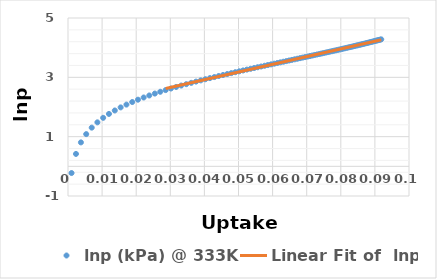
| Category | lnp (kPa) @ 333K |
|---|---|
| 0.00104 | -0.226 |
| 0.00234 | 0.418 |
| 0.00379 | 0.807 |
| 0.00534 | 1.086 |
| 0.00696 | 1.304 |
| 0.00862 | 1.483 |
| 0.01031 | 1.635 |
| 0.01201 | 1.766 |
| 0.01372 | 1.883 |
| 0.01544 | 1.987 |
| 0.01714 | 2.081 |
| 0.01884 | 2.167 |
| 0.02052 | 2.247 |
| 0.02219 | 2.32 |
| 0.02384 | 2.389 |
| 0.02546 | 2.453 |
| 0.02706 | 2.513 |
| 0.02864 | 2.57 |
| 0.03019 | 2.624 |
| 0.03171 | 2.675 |
| 0.03321 | 2.723 |
| 0.03468 | 2.769 |
| 0.03613 | 2.814 |
| 0.03754 | 2.856 |
| 0.03893 | 2.897 |
| 0.04029 | 2.936 |
| 0.04162 | 2.973 |
| 0.04293 | 3.01 |
| 0.04421 | 3.045 |
| 0.04546 | 3.078 |
| 0.04669 | 3.111 |
| 0.04789 | 3.143 |
| 0.04907 | 3.173 |
| 0.05022 | 3.203 |
| 0.05135 | 3.232 |
| 0.05245 | 3.26 |
| 0.05353 | 3.287 |
| 0.05459 | 3.314 |
| 0.05562 | 3.34 |
| 0.05664 | 3.365 |
| 0.05763 | 3.39 |
| 0.0586 | 3.414 |
| 0.05955 | 3.437 |
| 0.06048 | 3.46 |
| 0.06139 | 3.483 |
| 0.06228 | 3.505 |
| 0.06316 | 3.526 |
| 0.06401 | 3.547 |
| 0.06485 | 3.568 |
| 0.06567 | 3.588 |
| 0.06648 | 3.608 |
| 0.06726 | 3.627 |
| 0.06804 | 3.646 |
| 0.06879 | 3.665 |
| 0.06953 | 3.683 |
| 0.07026 | 3.701 |
| 0.07097 | 3.719 |
| 0.07167 | 3.736 |
| 0.07235 | 3.753 |
| 0.07302 | 3.77 |
| 0.07368 | 3.786 |
| 0.07433 | 3.802 |
| 0.07496 | 3.818 |
| 0.07558 | 3.834 |
| 0.07619 | 3.85 |
| 0.07678 | 3.865 |
| 0.07737 | 3.88 |
| 0.07794 | 3.895 |
| 0.07851 | 3.909 |
| 0.07906 | 3.924 |
| 0.07961 | 3.938 |
| 0.08014 | 3.952 |
| 0.08066 | 3.966 |
| 0.08118 | 3.979 |
| 0.08168 | 3.993 |
| 0.08218 | 4.006 |
| 0.08267 | 4.019 |
| 0.08315 | 4.032 |
| 0.08362 | 4.044 |
| 0.08408 | 4.057 |
| 0.08453 | 4.069 |
| 0.08498 | 4.082 |
| 0.08542 | 4.094 |
| 0.08585 | 4.106 |
| 0.08627 | 4.118 |
| 0.08669 | 4.129 |
| 0.0871 | 4.141 |
| 0.0875 | 4.152 |
| 0.0879 | 4.163 |
| 0.08829 | 4.175 |
| 0.08867 | 4.186 |
| 0.08905 | 4.197 |
| 0.08942 | 4.207 |
| 0.08978 | 4.218 |
| 0.09014 | 4.229 |
| 0.0905 | 4.239 |
| 0.09085 | 4.249 |
| 0.09119 | 4.26 |
| 0.09152 | 4.27 |
| 0.09186 | 4.28 |